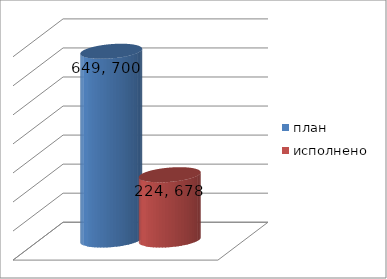
| Category | план | исполнено |
|---|---|---|
| 0 | 649700341.8 | 224678915.43 |